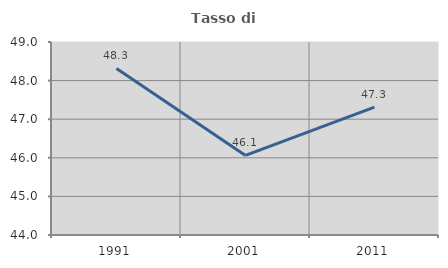
| Category | Tasso di occupazione   |
|---|---|
| 1991.0 | 48.316 |
| 2001.0 | 46.062 |
| 2011.0 | 47.311 |